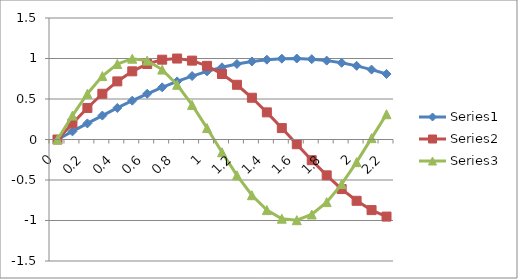
| Category | Series 0 | Series 1 | Series 2 |
|---|---|---|---|
| 0.0 | 0 | 0 | 0 |
| 0.1 | 0.1 | 0.199 | 0.296 |
| 0.2 | 0.199 | 0.389 | 0.565 |
| 0.30000000000000004 | 0.296 | 0.565 | 0.783 |
| 0.4 | 0.389 | 0.717 | 0.932 |
| 0.5 | 0.479 | 0.841 | 0.997 |
| 0.6 | 0.565 | 0.932 | 0.974 |
| 0.7 | 0.644 | 0.985 | 0.863 |
| 0.7999999999999999 | 0.717 | 1 | 0.675 |
| 0.8999999999999999 | 0.783 | 0.974 | 0.427 |
| 0.9999999999999999 | 0.841 | 0.909 | 0.141 |
| 1.0999999999999999 | 0.891 | 0.808 | -0.158 |
| 1.2 | 0.932 | 0.675 | -0.443 |
| 1.3 | 0.964 | 0.516 | -0.688 |
| 1.4000000000000001 | 0.985 | 0.335 | -0.872 |
| 1.5000000000000002 | 0.997 | 0.141 | -0.978 |
| 1.6000000000000003 | 1 | -0.058 | -0.996 |
| 1.7000000000000004 | 0.992 | -0.256 | -0.926 |
| 1.8000000000000005 | 0.974 | -0.443 | -0.773 |
| 1.9000000000000006 | 0.946 | -0.612 | -0.551 |
| 2.0000000000000004 | 0.909 | -0.757 | -0.279 |
| 2.1000000000000005 | 0.863 | -0.872 | 0.017 |
| 2.2000000000000006 | 0.808 | -0.952 | 0.312 |